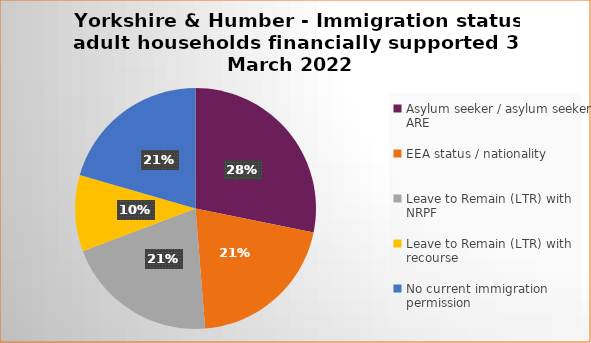
| Category | Number  | Percentage |
|---|---|---|
| Asylum seeker / asylum seeker ARE | 11 | 0.282 |
| EEA status / nationality  | 8 | 0.205 |
| Leave to Remain (LTR) with NRPF | 8 | 0.205 |
| Leave to Remain (LTR) with recourse | 4 | 0.103 |
| No current immigration permission | 8 | 0.205 |